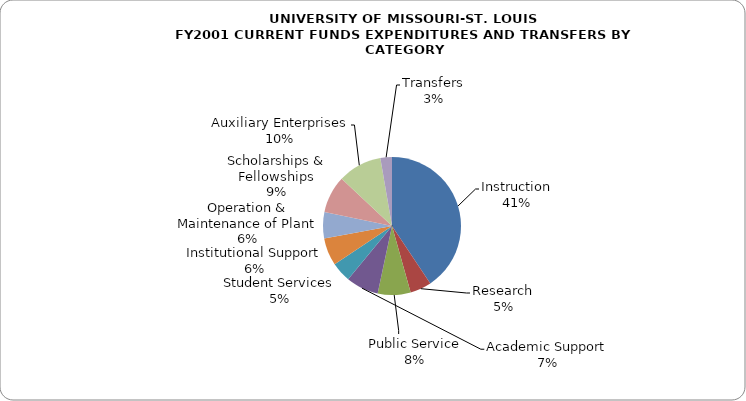
| Category | FY2001 |
|---|---|
| Instruction | 0.406 |
| Research | 0.05 |
| Public Service | 0.077 |
| Academic Support | 0.076 |
| Student Services | 0.047 |
| Institutional Support | 0.065 |
| Operation & Maintenance of Plant | 0.061 |
| Scholarships & Fellowships | 0.087 |
| Auxiliary Enterprises | 0.103 |
| Transfers | 0.027 |